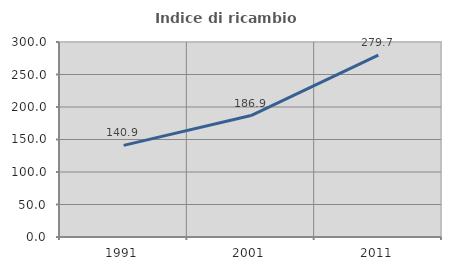
| Category | Indice di ricambio occupazionale  |
|---|---|
| 1991.0 | 140.923 |
| 2001.0 | 186.885 |
| 2011.0 | 279.717 |